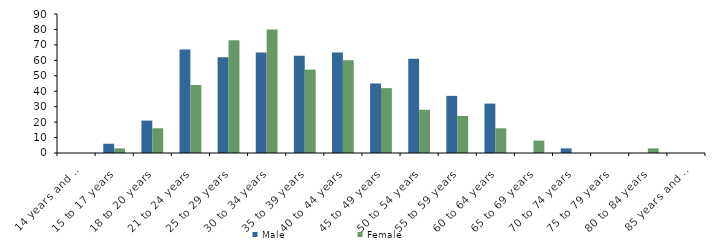
| Category | Male | Female |
|---|---|---|
| 14 years and under | 0 | 0 |
| 15 to 17 years | 6 | 3 |
| 18 to 20 years | 21 | 16 |
| 21 to 24 years | 67 | 44 |
| 25 to 29 years | 62 | 73 |
| 30 to 34 years | 65 | 80 |
| 35 to 39 years | 63 | 54 |
| 40 to 44 years | 65 | 60 |
| 45 to 49 years | 45 | 42 |
| 50 to 54 years | 61 | 28 |
| 55 to 59 years | 37 | 24 |
| 60 to 64 years | 32 | 16 |
| 65 to 69 years | 0 | 8 |
| 70 to 74 years | 3 | 0 |
| 75 to 79 years | 0 | 0 |
| 80 to 84 years | 0 | 3 |
| 85 years and over | 0 | 0 |